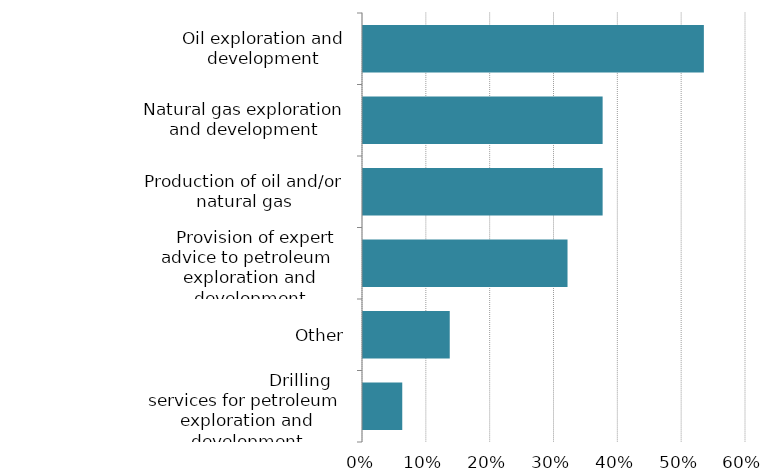
| Category | Series 0 |
|---|---|
|                        Drilling services for petroleum 
exploration and development companies | 0.062 |
| Other | 0.136 |
|    Provision of expert advice to petroleum 
exploration and development companies | 0.32 |
| Production of oil and/or natural gas | 0.375 |
| Natural gas exploration and development | 0.375 |
| Oil exploration and development | 0.534 |